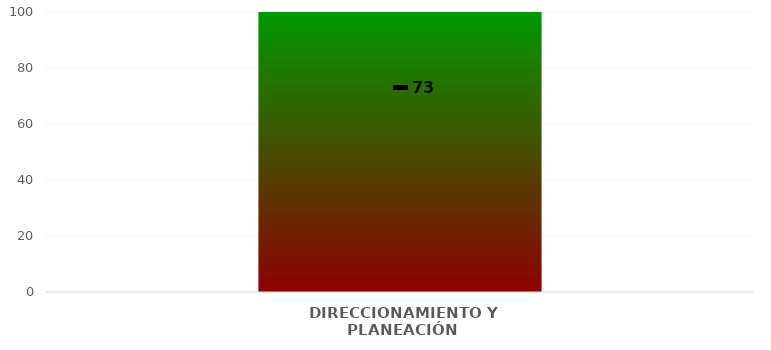
| Category | Niveles |
|---|---|
| DIRECCIONAMIENTO Y PLANEACIÓN | 100 |